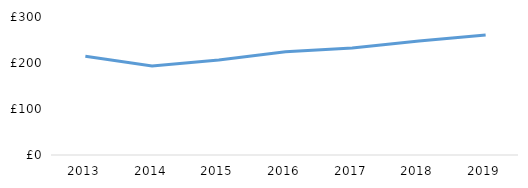
| Category | All tourism related jobs |
|---|---|
| 2013.0 | 214.5 |
| 2014.0 | 193.4 |
| 2015.0 | 206.4 |
| 2016.0 | 224.5 |
| 2017.0 | 232.4 |
| 2018.0 | 247.8 |
| 2019.0 | 261 |